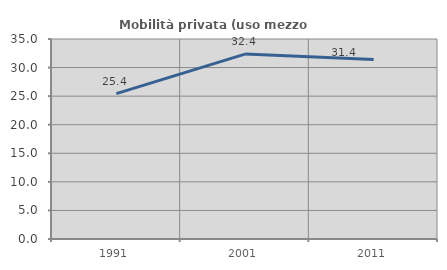
| Category | Mobilità privata (uso mezzo privato) |
|---|---|
| 1991.0 | 25.44 |
| 2001.0 | 32.358 |
| 2011.0 | 31.432 |